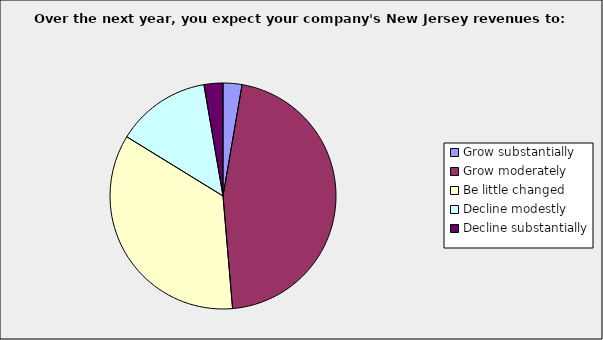
| Category | Series 0 |
|---|---|
| Grow substantially | 0.027 |
| Grow moderately | 0.459 |
| Be little changed | 0.351 |
| Decline modestly | 0.135 |
| Decline substantially | 0.027 |